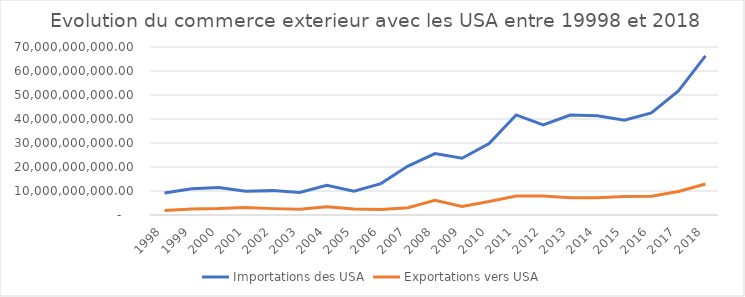
| Category | Importations des USA | Exportations vers USA |
|---|---|---|
| 1998.0 | 9189116719 | 1888562604 |
| 1999.0 | 10971650344 | 2510883783 |
| 2000.0 | 11493468325 | 2693451584 |
| 2001.0 | 9904816559 | 3125898923 |
| 2002.0 | 10156083283 | 2656606850 |
| 2003.0 | 9422057701 | 2346619084 |
| 2004.0 | 12366559630 | 3418728239 |
| 2005.0 | 9905200402 | 2534852851 |
| 2006.0 | 13091546082 | 2253754530 |
| 2007.0 | 20401458345 | 2994397069 |
| 2008.0 | 25585839373 | 6085166997 |
| 2009.0 | 23663470674 | 3560058303 |
| 2010.0 | 29735265475 | 5640434029 |
| 2011.0 | 41684242624 | 7949798215 |
| 2012.0 | 37508640060.447 | 7883682752.149 |
| 2013.0 | 41668655099.558 | 7195098013.442 |
| 2014.0 | 41335543181.7 | 7188045160.42 |
| 2015.0 | 39456777451.876 | 7691023137.947 |
| 2016.0 | 42568492322.996 | 7794139232.959 |
| 2017.0 | 51685093336.618 | 9774649556.027 |
| 2018.0 | 66295385853.37 | 12941061253.688 |